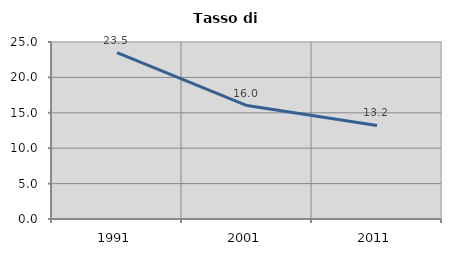
| Category | Tasso di disoccupazione   |
|---|---|
| 1991.0 | 23.49 |
| 2001.0 | 16.026 |
| 2011.0 | 13.218 |